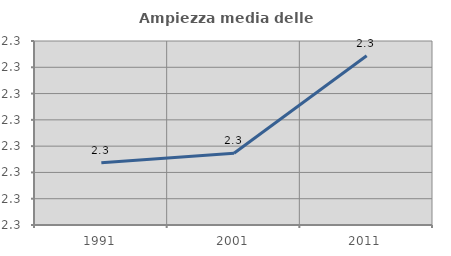
| Category | Ampiezza media delle famiglie |
|---|---|
| 1991.0 | 2.284 |
| 2001.0 | 2.287 |
| 2011.0 | 2.324 |